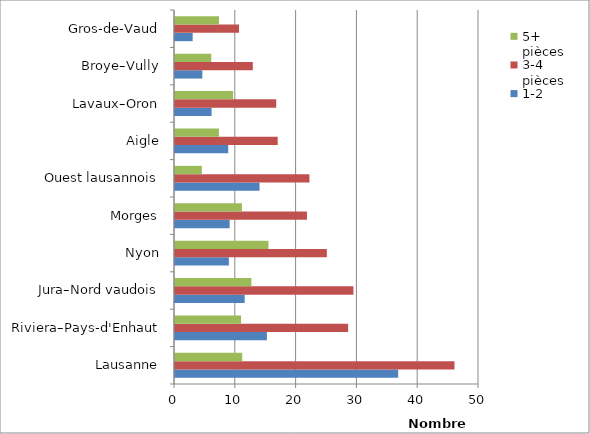
| Category | 1-2 pièces | 3-4 pièces | 5+ pièces |
|---|---|---|---|
| Lausanne | 36705 | 45972 | 11052 |
| Riviera–Pays-d'Enhaut | 15114 | 28475 | 10869 |
| Jura–Nord vaudois | 11460 | 29346 | 12562 |
| Nyon | 8859 | 24976 | 15368 |
| Morges | 8987 | 21706 | 11005 |
| Ouest lausannois | 13904 | 22113 | 4419 |
| Aigle | 8752 | 16892 | 7225 |
| Lavaux–Oron | 6019 | 16655 | 9553 |
| Broye–Vully | 4494 | 12799 | 5963 |
| Gros-de-Vaud | 2908 | 10532 | 7232 |